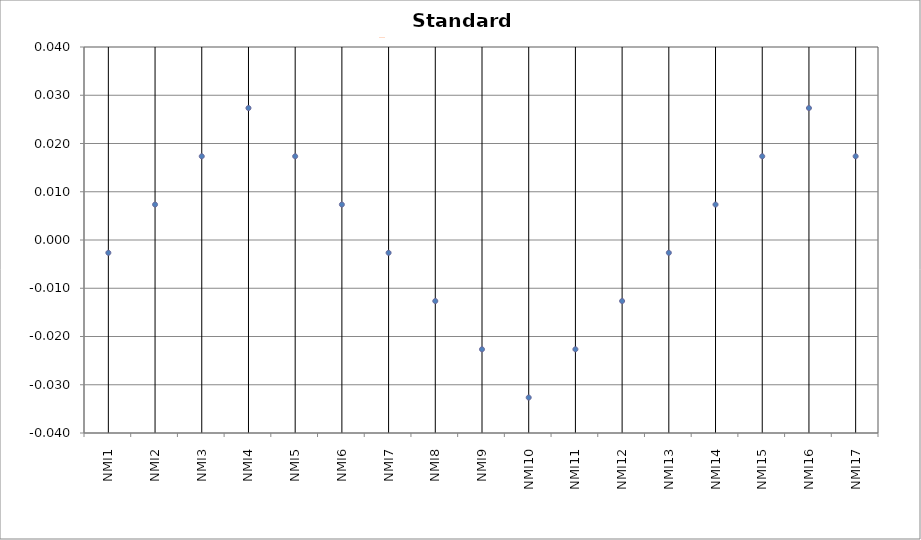
| Category | Series 0 |
|---|---|
| NMI1 | -0.003 |
| NMI2 | 0.007 |
| NMI3 | 0.017 |
| NMI4 | 0.027 |
| NMI5 | 0.017 |
| NMI6 | 0.007 |
| NMI7 | -0.003 |
| NMI8 | -0.013 |
| NMI9 | -0.023 |
| NMI10 | -0.033 |
| NMI11 | -0.023 |
| NMI12 | -0.013 |
| NMI13 | -0.003 |
| NMI14 | 0.007 |
| NMI15 | 0.017 |
| NMI16 | 0.027 |
| NMI17 | 0.017 |